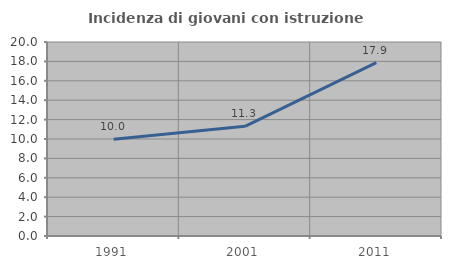
| Category | Incidenza di giovani con istruzione universitaria |
|---|---|
| 1991.0 | 9.982 |
| 2001.0 | 11.311 |
| 2011.0 | 17.879 |